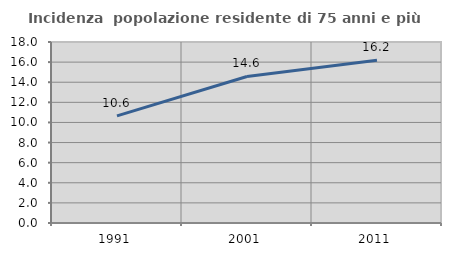
| Category | Incidenza  popolazione residente di 75 anni e più |
|---|---|
| 1991.0 | 10.649 |
| 2001.0 | 14.57 |
| 2011.0 | 16.184 |